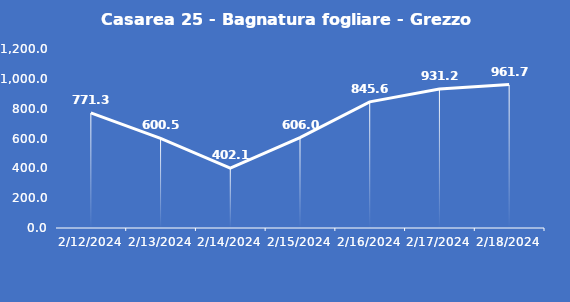
| Category | Casarea 25 - Bagnatura fogliare - Grezzo (min) |
|---|---|
| 2/12/24 | 771.3 |
| 2/13/24 | 600.5 |
| 2/14/24 | 402.1 |
| 2/15/24 | 606 |
| 2/16/24 | 845.6 |
| 2/17/24 | 931.2 |
| 2/18/24 | 961.7 |